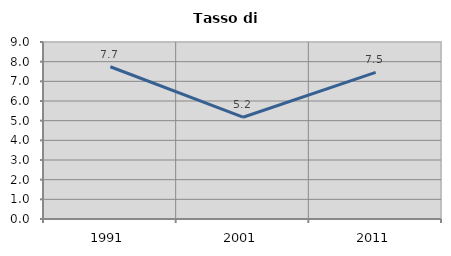
| Category | Tasso di disoccupazione   |
|---|---|
| 1991.0 | 7.741 |
| 2001.0 | 5.176 |
| 2011.0 | 7.452 |